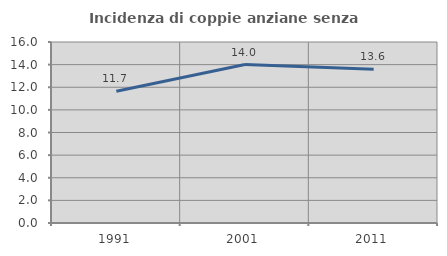
| Category | Incidenza di coppie anziane senza figli  |
|---|---|
| 1991.0 | 11.654 |
| 2001.0 | 14.01 |
| 2011.0 | 13.594 |